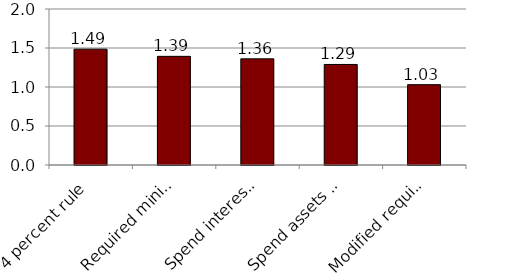
| Category | Series 0 |
|---|---|
| 4 percent rule | 1.485 |
| Required minimum distribution | 1.393 |
| Spend interest, dividends only | 1.361 |
| Spend assets over expected lifetime | 1.289 |
| Modified required minimum distribution | 1.03 |